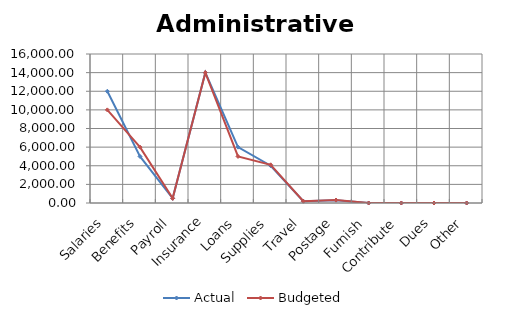
| Category | Actual | Budgeted |
|---|---|---|
| Salaries | 12000 | 10000 |
| Benefits | 5000 | 6000 |
| Payroll | 500 | 500 |
| Insurance | 14000 | 14000 |
| Loans | 6000 | 5000 |
| Supplies | 4000 | 4100 |
| Travel | 200 | 190 |
| Postage | 300 | 320 |
| Furnish | 0 | 0 |
| Contribute | 0 | 0 |
| Dues | 0 | 0 |
| Other | 0 | 0 |